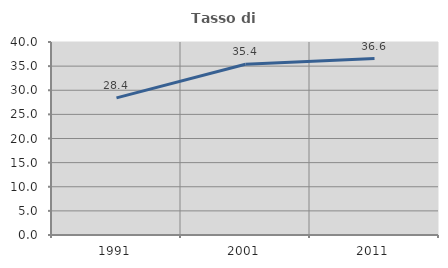
| Category | Tasso di occupazione   |
|---|---|
| 1991.0 | 28.425 |
| 2001.0 | 35.4 |
| 2011.0 | 36.557 |